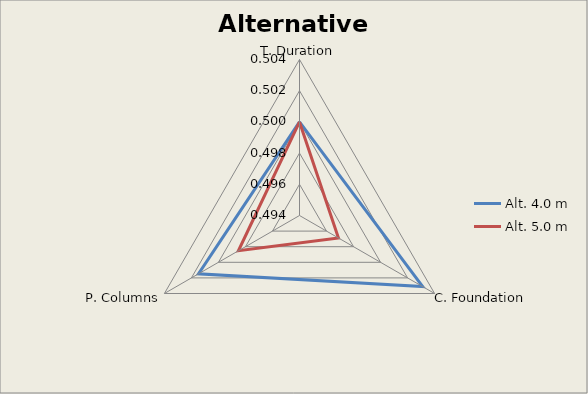
| Category | Alt. 4.0 m | Alt. 5.0 m |
|---|---|---|
| T. Duration | 0.5 | 0.5 |
| C. Foundation | 0.503 | 0.497 |
| P. Columns | 0.501 | 0.499 |